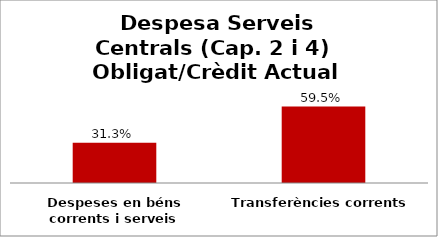
| Category | Series 0 |
|---|---|
| Despeses en béns corrents i serveis | 0.313 |
| Transferències corrents | 0.595 |